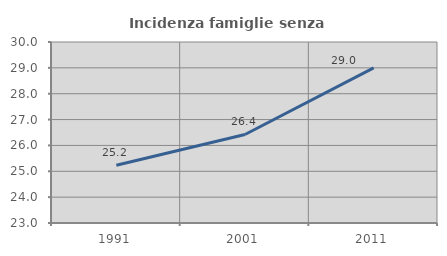
| Category | Incidenza famiglie senza nuclei |
|---|---|
| 1991.0 | 25.236 |
| 2001.0 | 26.424 |
| 2011.0 | 29.001 |